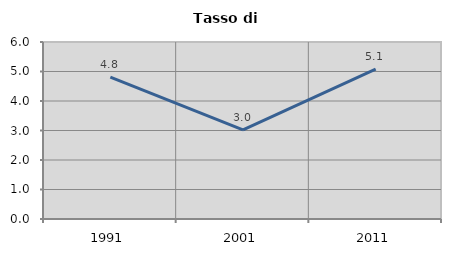
| Category | Tasso di disoccupazione   |
|---|---|
| 1991.0 | 4.81 |
| 2001.0 | 3.019 |
| 2011.0 | 5.079 |